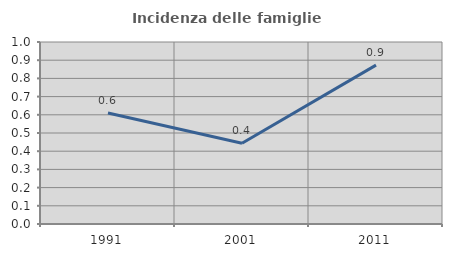
| Category | Incidenza delle famiglie numerose |
|---|---|
| 1991.0 | 0.61 |
| 2001.0 | 0.444 |
| 2011.0 | 0.873 |